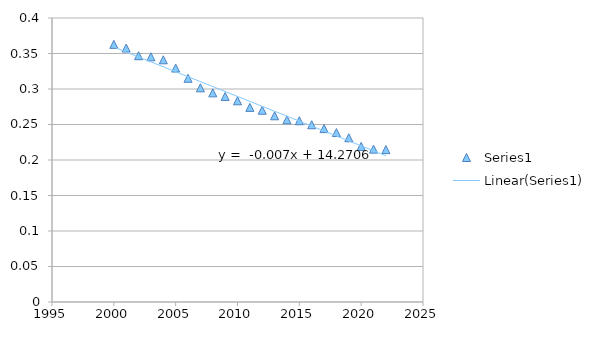
| Category | Series 0 |
|---|---|
| 2000.0 | 0.363 |
| 2001.0 | 0.358 |
| 2002.0 | 0.347 |
| 2003.0 | 0.345 |
| 2004.0 | 0.341 |
| 2005.0 | 0.33 |
| 2006.0 | 0.315 |
| 2007.0 | 0.302 |
| 2008.0 | 0.295 |
| 2009.0 | 0.29 |
| 2010.0 | 0.283 |
| 2011.0 | 0.274 |
| 2012.0 | 0.27 |
| 2013.0 | 0.262 |
| 2014.0 | 0.257 |
| 2015.0 | 0.255 |
| 2016.0 | 0.25 |
| 2017.0 | 0.244 |
| 2018.0 | 0.239 |
| 2019.0 | 0.231 |
| 2020.0 | 0.219 |
| 2021.0 | 0.215 |
| 2022.0 | 0.215 |